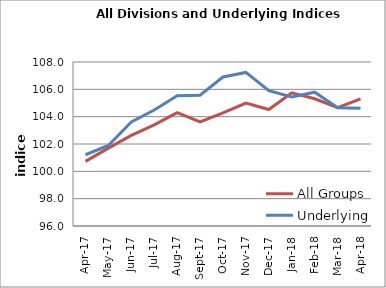
| Category | All Groups | Underlying |
|---|---|---|
| 2017-04-01 | 100.727 | 101.214 |
| 2017-05-01 | 101.699 | 101.894 |
| 2017-06-01 | 102.633 | 103.613 |
| 2017-07-01 | 103.397 | 104.483 |
| 2017-08-01 | 104.291 | 105.536 |
| 2017-09-01 | 103.612 | 105.565 |
| 2017-10-01 | 104.27 | 106.905 |
| 2017-11-01 | 104.991 | 107.237 |
| 2017-12-01 | 104.521 | 105.901 |
| 2018-01-01 | 105.739 | 105.443 |
| 2018-02-01 | 105.308 | 105.79 |
| 2018-03-01 | 104.655 | 104.651 |
| 2018-04-01 | 105.309 | 104.614 |